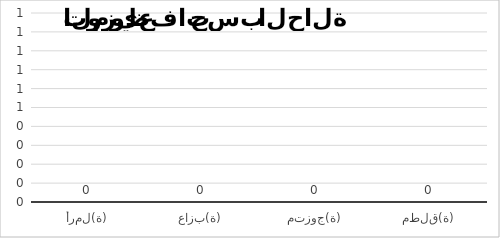
| Category | Series 1 |
|---|---|
| أرمل(ة) | 0 |
| عازب(ة) | 0 |
| متزوج(ة) | 0 |
| مطلق(ة) | 0 |